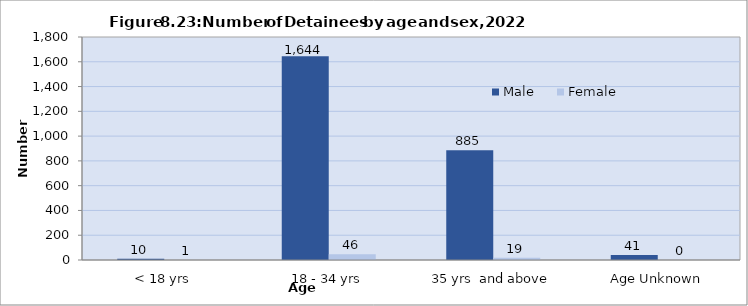
| Category | Male | Female |
|---|---|---|
| < 18 yrs | 10 | 1 |
| 18 - 34 yrs | 1644 | 46 |
| 35 yrs  and above | 885 | 19 |
| Age Unknown | 41 | 0 |